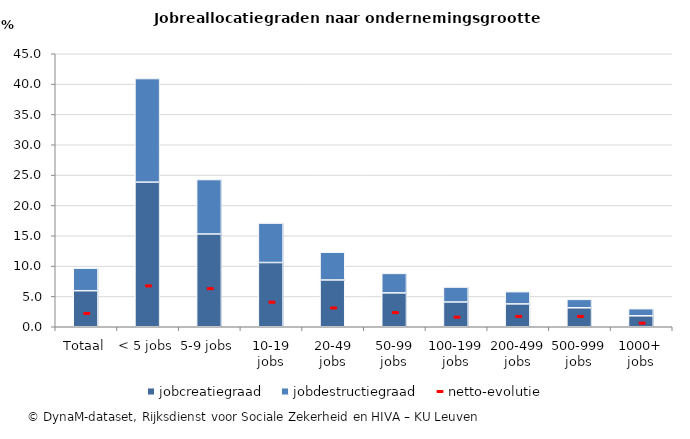
| Category | jobcreatiegraad | jobdestructiegraad |
|---|---|---|
| Totaal | 5.943 | 3.713 |
| < 5 jobs | 23.842 | 17.068 |
| 5-9 jobs | 15.293 | 8.973 |
| 10-19 jobs | 10.588 | 6.498 |
| 20-49 jobs | 7.713 | 4.574 |
| 50-99 jobs | 5.583 | 3.212 |
| 100-199 jobs | 4.083 | 2.461 |
| 200-499 jobs | 3.766 | 2.018 |
| 500-999 jobs | 3.129 | 1.386 |
| 1000+ jobs | 1.807 | 1.169 |